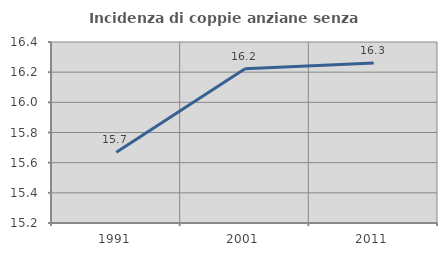
| Category | Incidenza di coppie anziane senza figli  |
|---|---|
| 1991.0 | 15.67 |
| 2001.0 | 16.223 |
| 2011.0 | 16.26 |